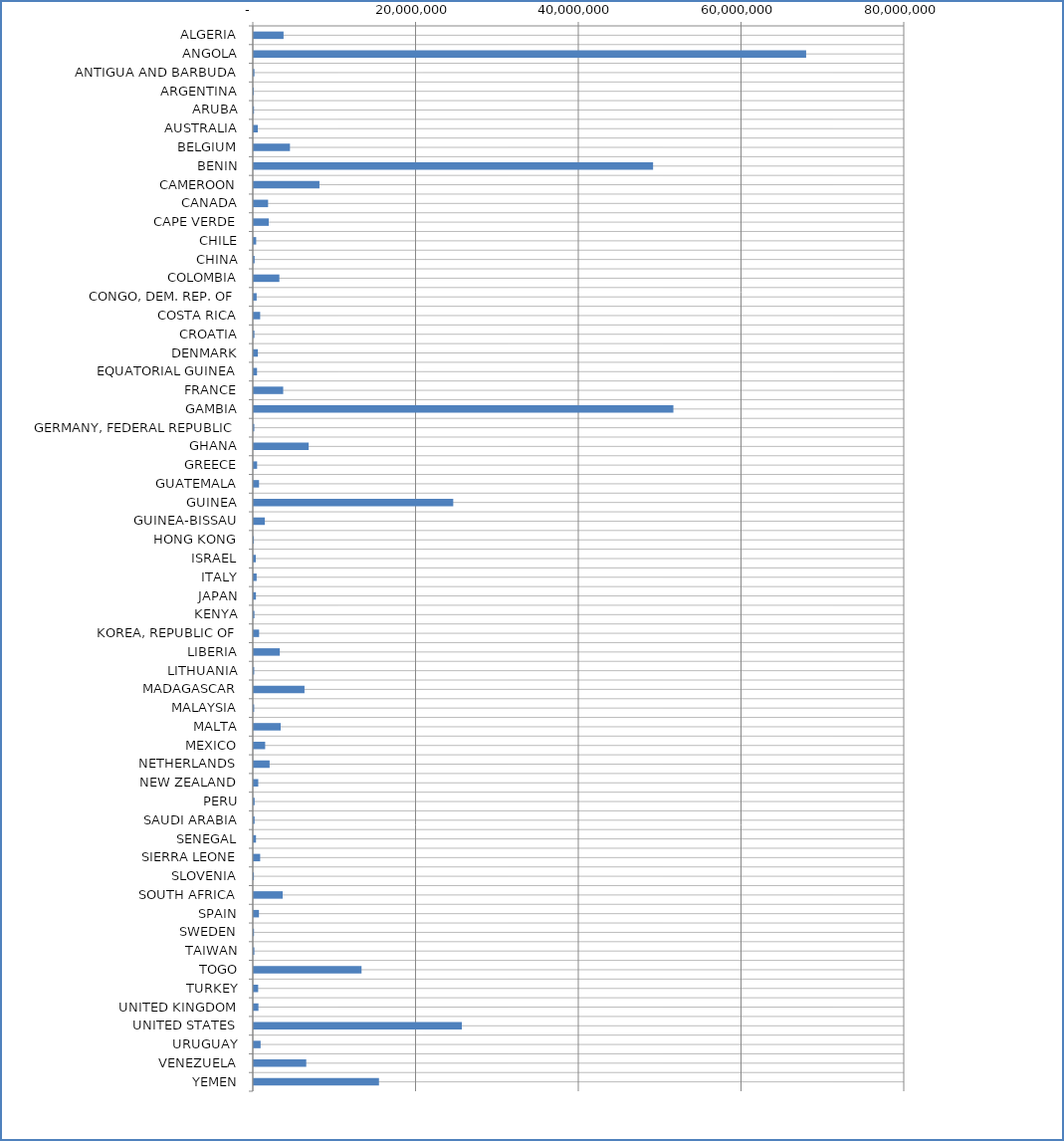
| Category | Series 0 |
|---|---|
| ALGERIA | 3655935 |
| ANGOLA | 67882058 |
| ANTIGUA AND BARBUDA | 78394 |
| ARGENTINA | 3761 |
| ARUBA | 26000 |
| AUSTRALIA | 487769 |
| BELGIUM | 4444429 |
| BENIN | 49071555 |
| CAMEROON | 8068987 |
| CANADA | 1754453 |
| CAPE VERDE | 1838517 |
| CHILE | 292102 |
| CHINA | 101083 |
| COLOMBIA | 3142004 |
| CONGO, DEM. REP. OF | 351139 |
| COSTA RICA | 782521 |
| CROATIA | 75870 |
| DENMARK | 502104 |
| EQUATORIAL GUINEA | 396270 |
| FRANCE | 3613015 |
| GAMBIA | 51566701 |
| GERMANY, FEDERAL REPUBLIC | 61548 |
| GHANA | 6743783 |
| GREECE | 406231 |
| GUATEMALA | 641941 |
| GUINEA | 24511169 |
| GUINEA-BISSAU | 1354100 |
| HONG KONG | 10292 |
| ISRAEL | 244680 |
| ITALY | 349307 |
| JAPAN | 263016 |
| KENYA | 78156 |
| KOREA, REPUBLIC OF | 650522 |
| LIBERIA | 3195758 |
| LITHUANIA | 51163 |
| MADAGASCAR | 6229334 |
| MALAYSIA | 44960 |
| MALTA | 3304492 |
| MEXICO | 1395480 |
| NETHERLANDS | 1943657 |
| NEW ZEALAND | 546464 |
| PERU | 101160 |
| SAUDI ARABIA | 96714 |
| SENEGAL | 270864 |
| SIERRA LEONE | 782522 |
| SLOVENIA | 13104 |
| SOUTH AFRICA | 3546626 |
| SPAIN | 632690 |
| SWEDEN | 25290 |
| TAIWAN | 69388 |
| TOGO | 13240824 |
| TURKEY | 535834 |
| UNITED KINGDOM | 570228 |
| UNITED STATES | 25566151 |
| URUGUAY | 835879 |
| VENEZUELA | 6445820 |
| YEMEN | 15383415 |